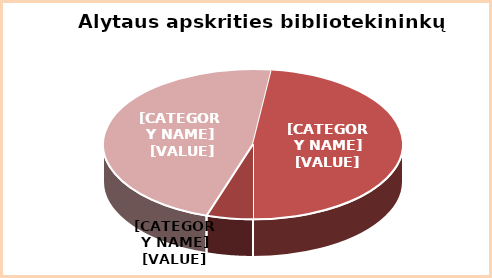
| Category | Series 0 |
|---|---|
| Aukštasis | 0.47 |
| Aukštesnysis | 0.48 |
| Kitas | 0.05 |